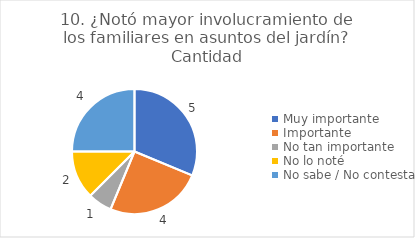
| Category | 10. ¿Notó mayor involucramiento de los familiares en asuntos del jardín? |
|---|---|
| Muy importante  | 0.312 |
| Importante  | 0.25 |
| No tan importante  | 0.062 |
| No lo noté  | 0.125 |
| No sabe / No contesta | 0.25 |